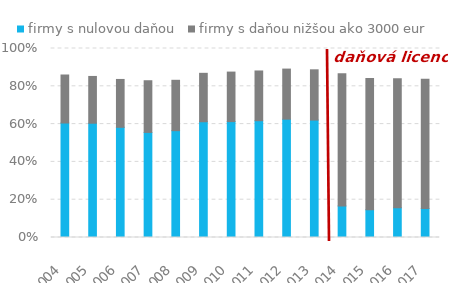
| Category | firmy s nulovou daňou | firmy s daňou nižšou ako 3000 eur |
|---|---|---|
| 2004.0 | 0.606 | 0.254 |
| 2005.0 | 0.605 | 0.248 |
| 2006.0 | 0.583 | 0.253 |
| 2007.0 | 0.556 | 0.273 |
| 2008.0 | 0.565 | 0.267 |
| 2009.0 | 0.612 | 0.256 |
| 2010.0 | 0.613 | 0.262 |
| 2011.0 | 0.618 | 0.263 |
| 2012.0 | 0.626 | 0.265 |
| 2013.0 | 0.621 | 0.266 |
| 2014.0 | 0.167 | 0.699 |
| 2015.0 | 0.147 | 0.694 |
| 2016.0 | 0.157 | 0.683 |
| 2017.0 | 0.153 | 0.685 |